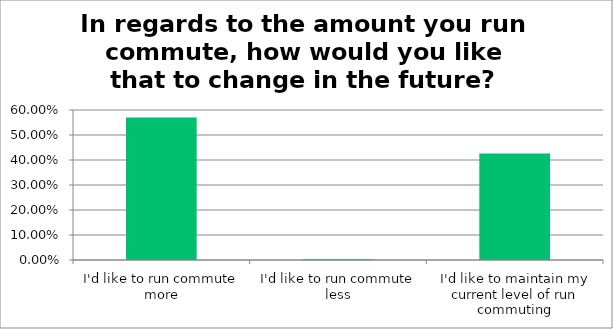
| Category | Responses |
|---|---|
| I'd like to run commute more | 0.57 |
| I'd like to run commute less | 0.004 |
| I'd like to maintain my current level of run commuting | 0.426 |